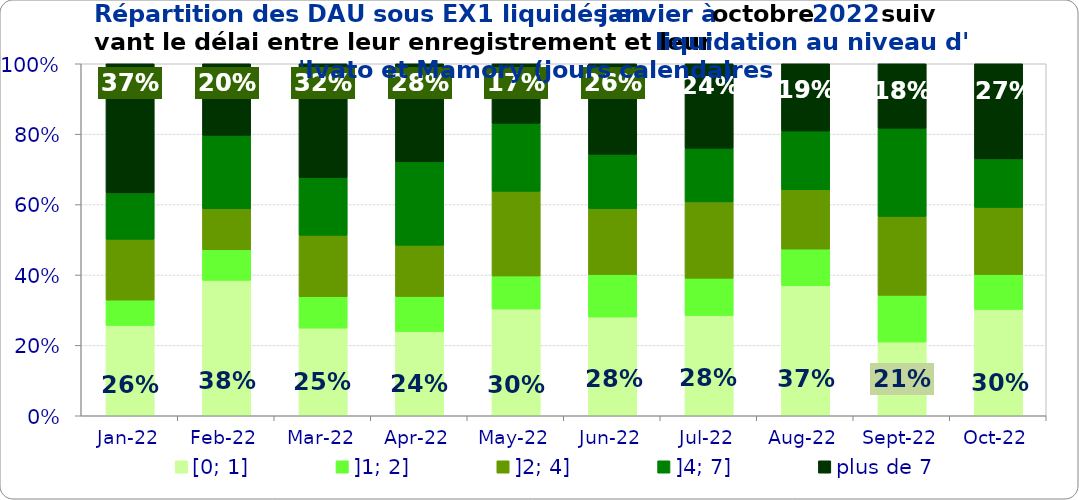
| Category | [0; 1] | ]1; 2] | ]2; 4] | ]4; 7] | plus de 7 |
|---|---|---|---|---|---|
| 2022-01-01 | 0.257 | 0.072 | 0.173 | 0.132 | 0.367 |
| 2022-02-01 | 0.385 | 0.087 | 0.117 | 0.208 | 0.203 |
| 2022-03-01 | 0.249 | 0.089 | 0.174 | 0.164 | 0.323 |
| 2022-04-01 | 0.239 | 0.1 | 0.146 | 0.237 | 0.279 |
| 2022-05-01 | 0.303 | 0.094 | 0.24 | 0.193 | 0.169 |
| 2022-06-01 | 0.281 | 0.121 | 0.187 | 0.155 | 0.257 |
| 2022-07-01 | 0.285 | 0.106 | 0.217 | 0.152 | 0.24 |
| 2022-08-01 | 0.369 | 0.104 | 0.169 | 0.167 | 0.191 |
| 2022-09-01 | 0.209 | 0.133 | 0.224 | 0.25 | 0.183 |
| 2022-10-01 | 0.302 | 0.099 | 0.191 | 0.138 | 0.27 |